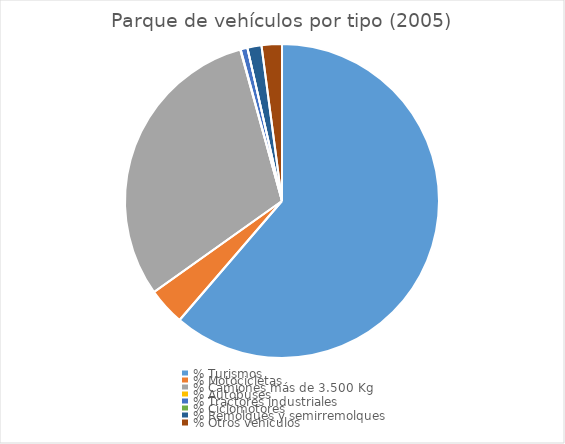
| Category | Series 0 |
|---|---|
| % Turismos | 0.613 |
| % Motocicletas | 0.039 |
| % Camiones más de 3.500 Kg | 0.306 |
| % Autobuses | 0 |
| % Tractores industriales | 0.007 |
| % Ciclomotores | 0 |
| % Remolques y semirremolques | 0.014 |
| % Otros vehículos | 0.021 |